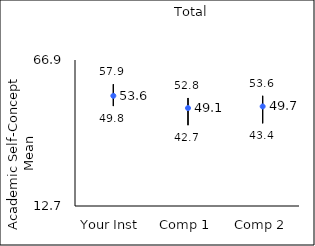
| Category | 25th percentile | 75th percentile | Mean |
|---|---|---|---|
| Your Inst | 49.8 | 57.9 | 53.6 |
| Comp 1 | 42.7 | 52.8 | 49.06 |
| Comp 2 | 43.4 | 53.6 | 49.66 |